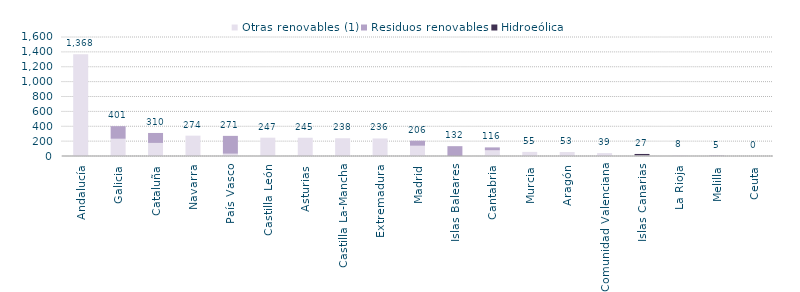
| Category | Otras renovables (1) | Residuos renovables | Hidroeólica |
|---|---|---|---|
| Andalucía | 1367.924 | 0 | 0 |
| Galicia | 232.034 | 169.117 | 0 |
| Cataluña | 175.728 | 134.044 | 0 |
| Navarra | 273.674 | 0 | 0 |
| País Vasco | 30.887 | 239.724 | 0 |
| Castilla León | 246.522 | 0 | 0 |
| Asturias | 245.323 | 0 | 0 |
| Castilla La-Mancha | 238.41 | 0 | 0 |
| Extremadura | 235.611 | 0 | 0 |
| Madrid | 137.922 | 67.762 | 0 |
| Islas Baleares | 1.31 | 130.805 | 0 |
| Cantabria | 76.573 | 39.092 | 0 |
| Murcia | 55.35 | 0 | 0 |
| Aragón | 53.33 | 0 | 0 |
| Comunidad Valenciana | 38.901 | 0 | 0 |
| Islas Canarias | 9.336 | 0 | 18.103 |
| La Rioja | 7.594 | 0 | 0 |
| Melilla | 0 | 4.85 | 0 |
| Ceuta | 0 | 0 | 0 |